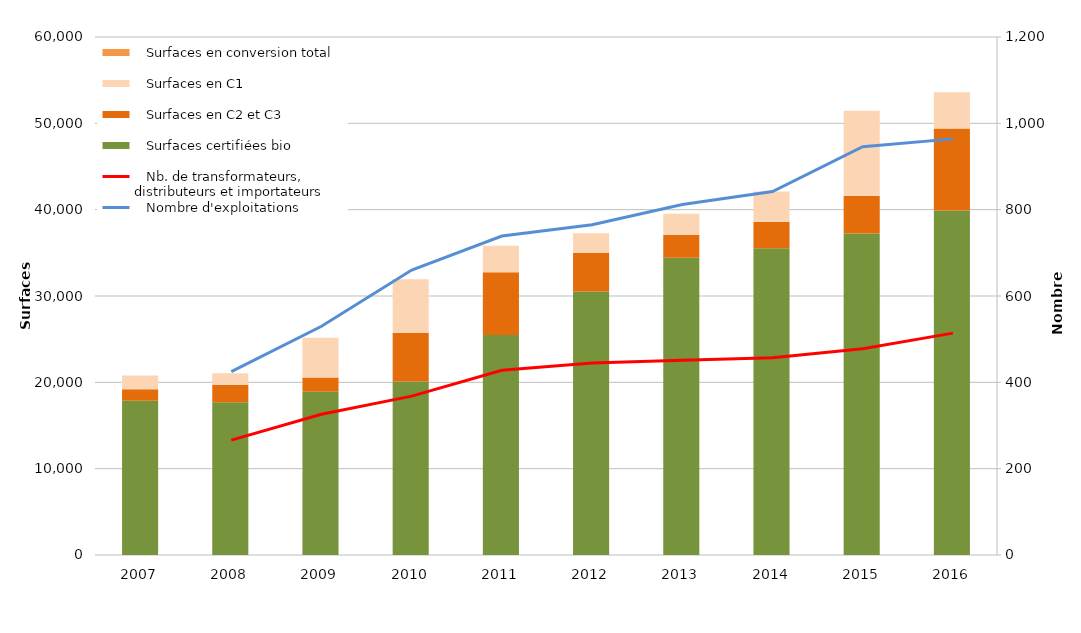
| Category |    Surfaces certifiées bio |    Surfaces en C2 et C3 |    Surfaces en C1 |    Surfaces en conversion total |
|---|---|---|---|---|
| 2007.0 | 17856.47 | 1354.832 | 1571.168 |  |
| 2008.0 | 17690.742 | 2031.202 | 1326.546 |  |
| 2009.0 | 18918.687 | 1652.513 | 4586.258 |  |
| 2010.0 | 20110.632 | 5611.703 | 6221.866 |  |
| 2011.0 | 25491.278 | 7254.527 | 3065.475 |  |
| 2012.0 | 30534.057 | 4437.02 | 2286.994 |  |
| 2013.0 | 34438.122 | 2655.668 | 2447.179 |  |
| 2014.0 | 35524.331 | 3080.403 | 3499.05 |  |
| 2015.0 | 37234.826 | 4382.979 | 9831.29 |  |
| 2016.0 | 39893.292 | 9499.891 | 4210.277 |  |